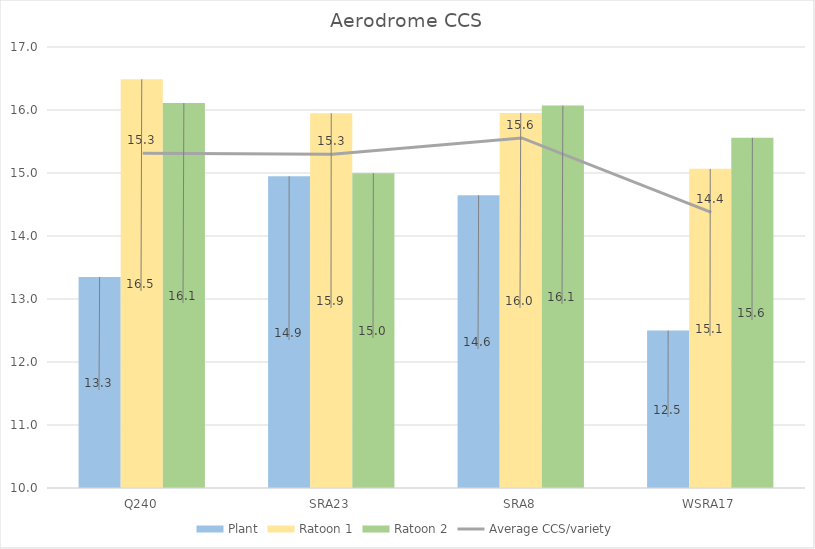
| Category | Plant | Ratoon 1 | Ratoon 2 |
|---|---|---|---|
| Q240 | 13.35 | 16.487 | 16.11 |
| SRA23 | 14.948 | 15.949 | 14.997 |
| SRA8 | 14.646 | 15.954 | 16.071 |
| WSRA17 | 12.499 | 15.066 | 15.559 |